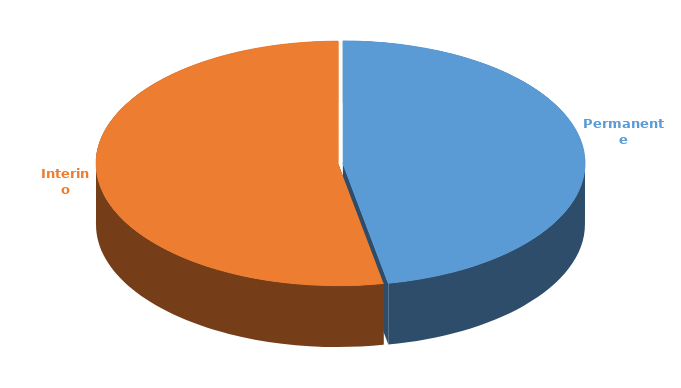
| Category | Cantidad |
|---|---|
| Permanente | 2853 |
| Interino | 3218 |